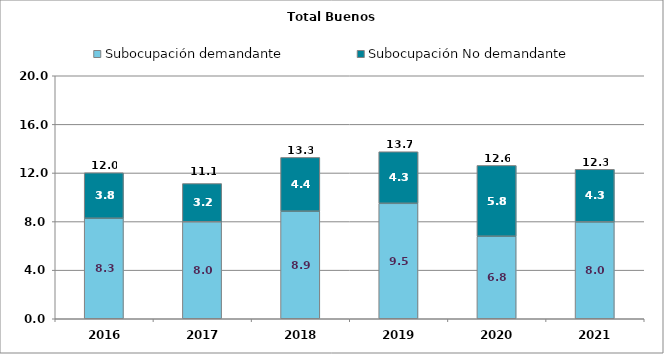
| Category | Subocupación demandante | Subocupación No demandante | Series 2 |
|---|---|---|---|
| 2016.0 | 8.27 | 3.75 | 12.01 |
| 2017.0 | 7.98 | 3.15 | 11.13 |
| 2018.0 | 8.85 | 4.43 | 13.28 |
| 2019.0 | 9.5 | 4.25 | 13.74 |
| 2020.0 | 6.79 | 5.83 | 12.62 |
| 2021.0 | 7.97 | 4.33 | 12.3 |